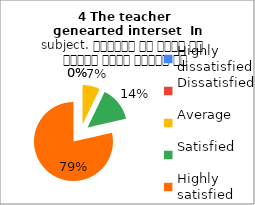
| Category | 4 The teacher 
genearted interset  In subject. शिक्षक ने विषय के प्रति रुचि जागृत की |
|---|---|
| Highly dissatisfied | 0 |
| Dissatisfied | 0 |
| Average | 1 |
| Satisfied | 2 |
| Highly satisfied | 11 |